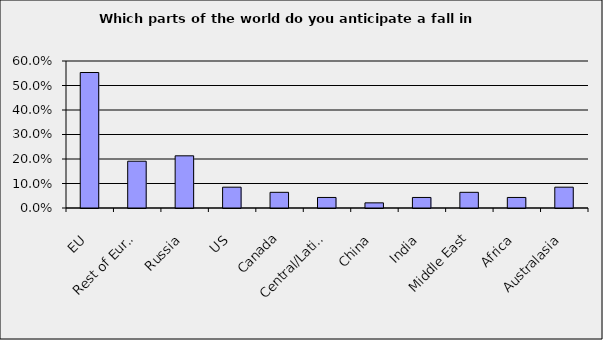
| Category | Series 0 |
|---|---|
| EU | 0.553 |
| Rest of Europe | 0.191 |
| Russia | 0.213 |
| US | 0.085 |
| Canada | 0.064 |
| Central/Latin America | 0.043 |
| China | 0.021 |
| India | 0.043 |
| Middle East | 0.064 |
| Africa | 0.043 |
| Australasia | 0.085 |